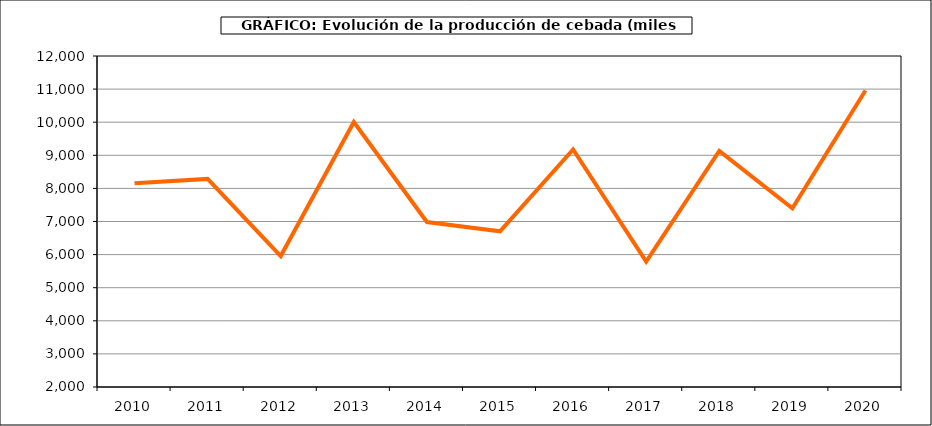
| Category | Producción |
|---|---|
| 2010.0 | 8154.392 |
| 2011.0 | 8287.073 |
| 2012.0 | 5956.347 |
| 2013.0 | 10004.998 |
| 2014.0 | 6983.289 |
| 2015.0 | 6705.106 |
| 2016.0 | 9176.159 |
| 2017.0 | 5785.944 |
| 2018.0 | 9129.535 |
| 2019.0 | 7399.966 |
| 2020.0 | 10955.78 |